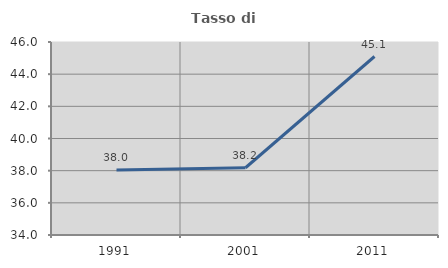
| Category | Tasso di occupazione   |
|---|---|
| 1991.0 | 38.034 |
| 2001.0 | 38.182 |
| 2011.0 | 45.098 |